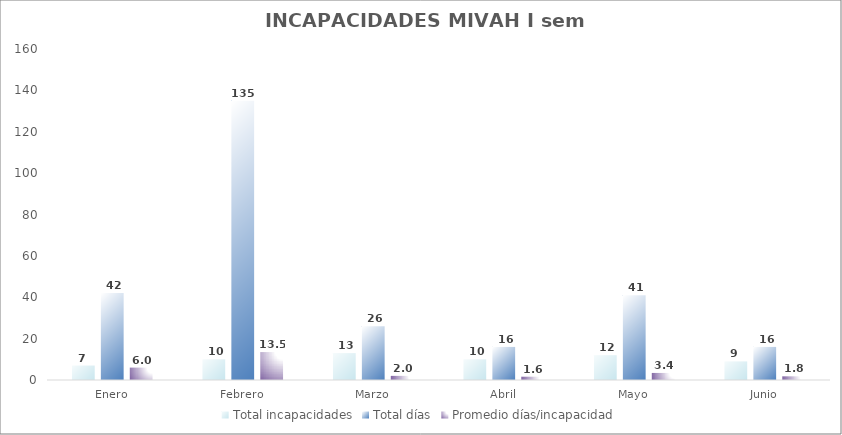
| Category | Total incapacidades | Total días | Promedio días/incapacidad |
|---|---|---|---|
| Enero | 7 | 42 | 6 |
| Febrero | 10 | 135 | 13.5 |
| Marzo | 13 | 26 | 2 |
| Abril | 10 | 16 | 1.6 |
| Mayo | 12 | 41 | 3.417 |
| Junio | 9 | 16 | 1.778 |